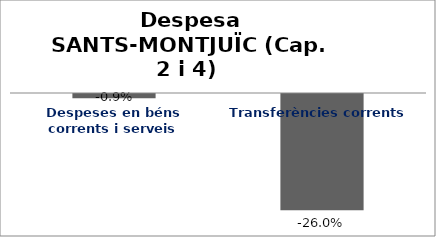
| Category | Series 0 |
|---|---|
| Despeses en béns corrents i serveis | -0.009 |
| Transferències corrents | -0.26 |